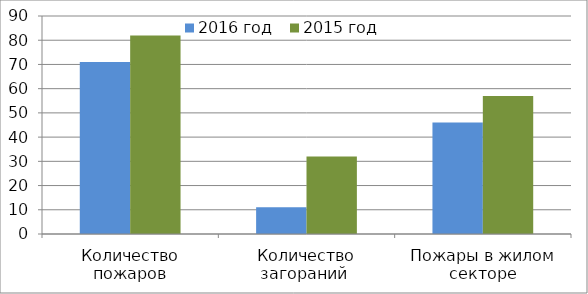
| Category | 2016 год | 2015 год |
|---|---|---|
| Количество пожаров | 71 | 82 |
| Количество загораний  | 11 | 32 |
| Пожары в жилом секторе | 46 | 57 |